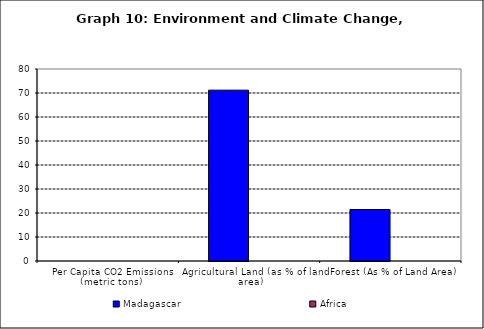
| Category | Madagascar | Africa |
|---|---|---|
| Per Capita CO2 Emissions (metric tons) | 0 | 0 |
| Agricultural Land (as % of land area) | 71.184 | 0 |
| Forest (As % of Land Area) | 21.439 | 0 |